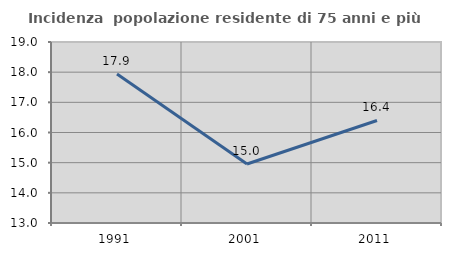
| Category | Incidenza  popolazione residente di 75 anni e più |
|---|---|
| 1991.0 | 17.936 |
| 2001.0 | 14.955 |
| 2011.0 | 16.399 |